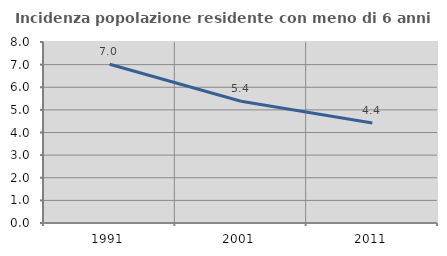
| Category | Incidenza popolazione residente con meno di 6 anni |
|---|---|
| 1991.0 | 7.017 |
| 2001.0 | 5.381 |
| 2011.0 | 4.416 |